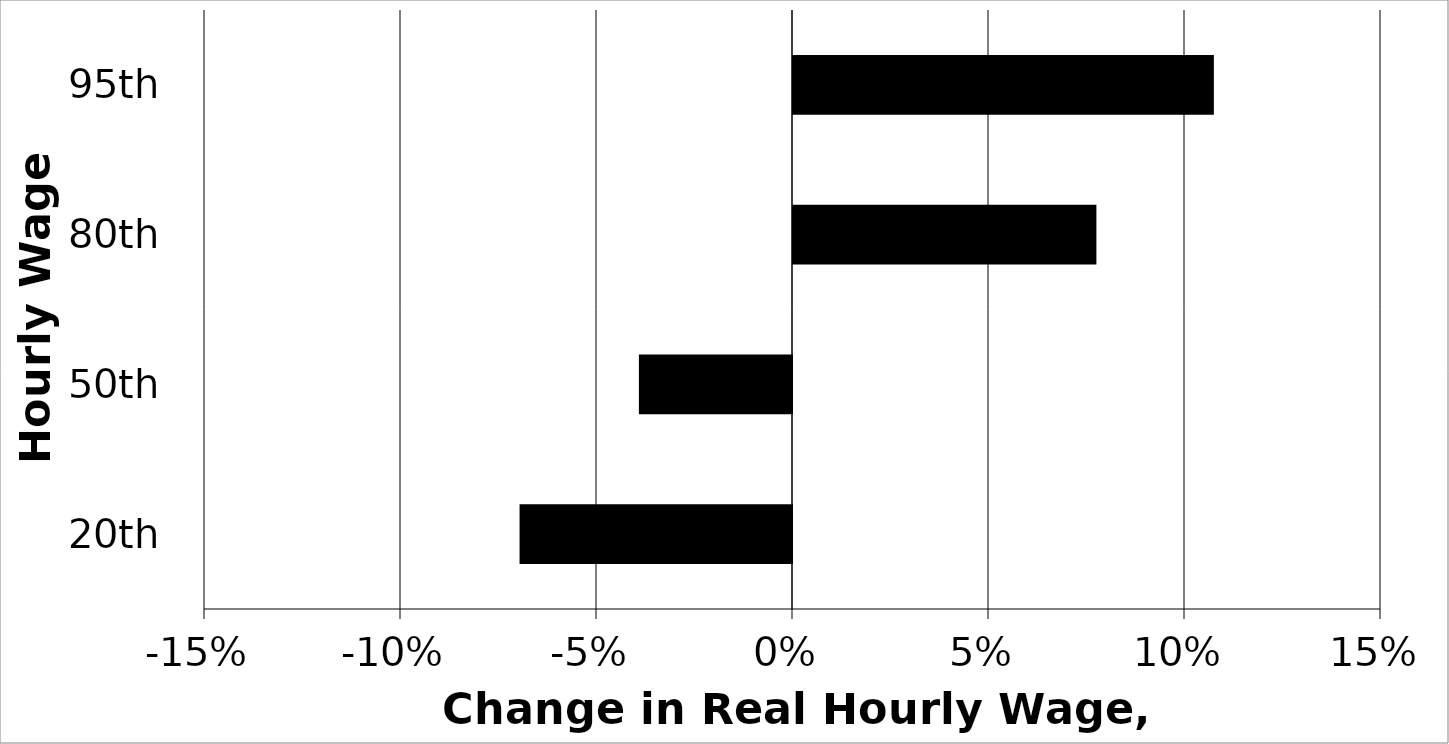
| Category | Series 0 |
|---|---|
| 20th | -0.069 |
| 50th | -0.039 |
| 80th | 0.077 |
| 95th | 0.107 |